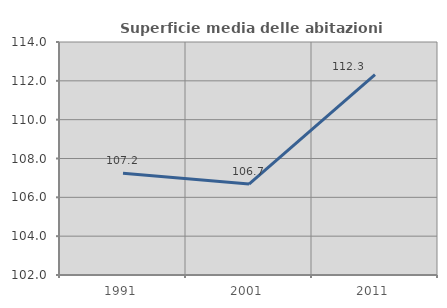
| Category | Superficie media delle abitazioni occupate |
|---|---|
| 1991.0 | 107.244 |
| 2001.0 | 106.681 |
| 2011.0 | 112.316 |